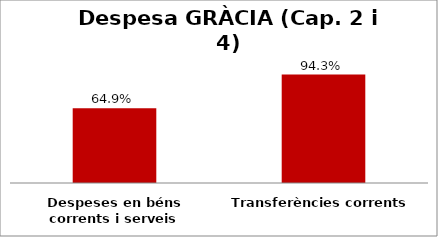
| Category | Series 0 |
|---|---|
| Despeses en béns corrents i serveis | 0.649 |
| Transferències corrents | 0.943 |